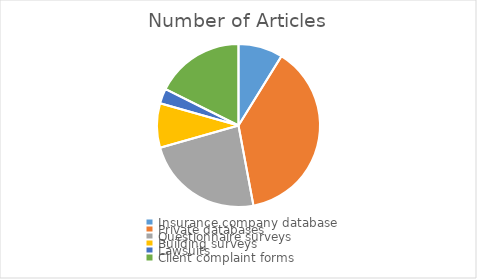
| Category | Number of Articles |
|---|---|
| Insurance company database | 3 |
| Private databases | 13 |
| Questionnaire surveys | 8 |
| Building surveys | 3 |
| Lawsuits | 1 |
| Client complaint forms | 6 |